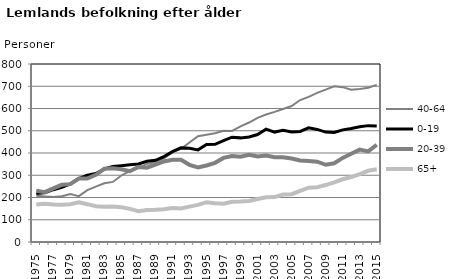
| Category | 40-64 | 0-19 | 20-39 | 65+ |
|---|---|---|---|---|
| 1975.0 | 208 | 218 | 230 | 169 |
| 1976.0 | 205 | 221 | 224 | 172 |
| 1977.0 | 202 | 235 | 241 | 169 |
| 1978.0 | 206 | 246 | 257 | 167 |
| 1979.0 | 216 | 261 | 260 | 170 |
| 1980.0 | 206 | 285 | 285 | 178 |
| 1981.0 | 233 | 300 | 285 | 170 |
| 1982.0 | 249 | 308 | 302 | 161 |
| 1983.0 | 264 | 328 | 329 | 158 |
| 1984.0 | 270 | 339 | 331 | 159 |
| 1985.0 | 299 | 343 | 327 | 156 |
| 1986.0 | 319 | 347 | 318 | 149 |
| 1987.0 | 333 | 351 | 337 | 138 |
| 1988.0 | 351 | 363 | 334 | 144 |
| 1989.0 | 359 | 367 | 348 | 145 |
| 1990.0 | 376 | 384 | 362 | 147 |
| 1991.0 | 404 | 406 | 370 | 153 |
| 1992.0 | 419 | 423 | 370 | 151 |
| 1993.0 | 447 | 421 | 347 | 159 |
| 1994.0 | 475 | 414 | 335 | 167 |
| 1995.0 | 482 | 438 | 344 | 179 |
| 1996.0 | 489 | 439 | 356 | 174 |
| 1997.0 | 500 | 456 | 378 | 172 |
| 1998.0 | 499 | 471 | 386 | 181 |
| 1999.0 | 520 | 468 | 383 | 182 |
| 2000.0 | 537 | 472 | 392 | 184 |
| 2001.0 | 558 | 483 | 384 | 193 |
| 2002.0 | 573 | 507 | 389 | 201 |
| 2003.0 | 585 | 494 | 381 | 202 |
| 2004.0 | 598 | 502 | 381 | 213 |
| 2005.0 | 611 | 494 | 375 | 215 |
| 2006.0 | 638 | 497 | 366 | 230 |
| 2007.0 | 652 | 513 | 364 | 244 |
| 2008.0 | 670 | 506 | 361 | 246 |
| 2009.0 | 685 | 494 | 347 | 256 |
| 2010.0 | 700 | 492 | 354 | 268 |
| 2011.0 | 696 | 504 | 378 | 282 |
| 2012.0 | 684 | 510 | 397 | 292 |
| 2013.0 | 688 | 518 | 415 | 305 |
| 2014.0 | 693 | 523 | 407 | 320 |
| 2015.0 | 706 | 521 | 437 | 327 |